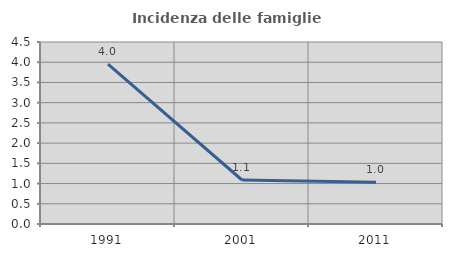
| Category | Incidenza delle famiglie numerose |
|---|---|
| 1991.0 | 3.953 |
| 2001.0 | 1.088 |
| 2011.0 | 1.031 |